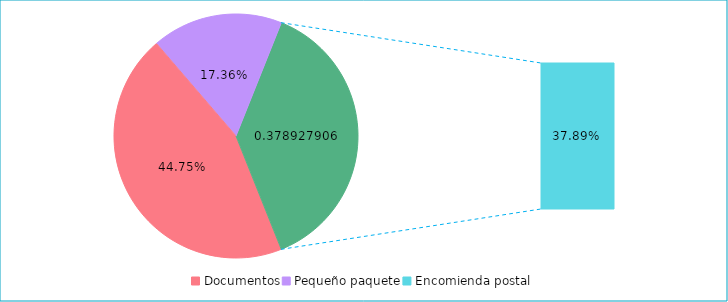
| Category | Series 0 |
|---|---|
| Documentos | 0.448 |
| Pequeño paquete | 0.174 |
| Encomienda postal | 0.379 |